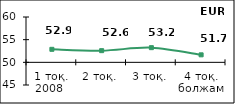
| Category | Диффузионный индекс* |
|---|---|
| 1 тоқ. 2008  | 52.87 |
| 2 тоқ. | 52.575 |
| 3 тоқ. | 53.235 |
| 4 тоқ. болжам | 51.655 |